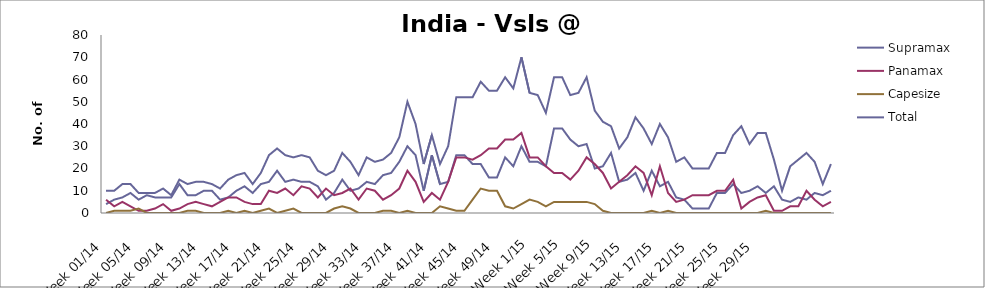
| Category | Supramax | Panamax | Capesize | Total |
|---|---|---|---|---|
| Week 01/14 | 4 | 6 | 0 | 10 |
| Week 02/14 | 6 | 3 | 1 | 10 |
| Week 03/14 | 7 | 5 | 1 | 13 |
| Week 04/14 | 9 | 3 | 1 | 13 |
| Week 05/14 | 6 | 1 | 2 | 9 |
| Week 06/14 | 8 | 1 | 0 | 9 |
| Week 07/14 | 7 | 2 | 0 | 9 |
| Week 08/14 | 7 | 4 | 0 | 11 |
| Week 09/14 | 7 | 1 | 0 | 8 |
| Week 10/14 | 13 | 2 | 0 | 15 |
| Week 11/14 | 8 | 4 | 1 | 13 |
| Week 12/14 | 8 | 5 | 1 | 14 |
| Week 13/14 | 10 | 4 | 0 | 14 |
| Week 14/14 | 10 | 3 | 0 | 13 |
| Week 15/14 | 6 | 5 | 0 | 11 |
| Week 16/14 | 7 | 7 | 1 | 15 |
| Week 17/14 | 10 | 7 | 0 | 17 |
| Week 18/14 | 12 | 5 | 1 | 18 |
| Week 19/14 | 9 | 4 | 0 | 13 |
| Week 20/14 | 13 | 4 | 1 | 18 |
| Week 21/14 | 14 | 10 | 2 | 26 |
| Week 22/14 | 19 | 9 | 0 | 29 |
| Week 23/14 | 14 | 11 | 1 | 26 |
| Week 24/14 | 15 | 8 | 2 | 25 |
| Week 25/14 | 14 | 12 | 0 | 26 |
| Week 26/14 | 14 | 11 | 0 | 25 |
| Week 27/14 | 12 | 7 | 0 | 19 |
| Week 28/14 | 6 | 11 | 0 | 17 |
| Week 29/14 | 9 | 8 | 2 | 19 |
| Week 30/14 | 15 | 9 | 3 | 27 |
| Week 31/14 | 10 | 11 | 2 | 23 |
| Week 32/14 | 11 | 6 | 0 | 17 |
| Week 33/14 | 14 | 11 | 0 | 25 |
| Week 34/14 | 13 | 10 | 0 | 23 |
| Week 35/14 | 17 | 6 | 1 | 24 |
| Week 36/14 | 18 | 8 | 1 | 27 |
| Week 37/14 | 23 | 11 | 0 | 34 |
| Week 38/14 | 30 | 19 | 1 | 50 |
| Week 39/14 | 26 | 14 | 0 | 40 |
| Week 40/14 | 10 | 5 | 0 | 22 |
| Week 41/14 | 26 | 9 | 0 | 35 |
| Week 42/14 | 13 | 6 | 3 | 22 |
| Week 43/14 | 14 | 14 | 2 | 30 |
| Week 44/14 | 26 | 25 | 1 | 52 |
| Week 45/14 | 26 | 25 | 1 | 52 |
| Week 46/14 | 22 | 24 | 6 | 52 |
| Week 47/14 | 22 | 26 | 11 | 59 |
| Week 48/14 | 16 | 29 | 10 | 55 |
| Week 49/14 | 16 | 29 | 10 | 55 |
| Week 50/14 | 25 | 33 | 3 | 61 |
| Week 51/14 | 21 | 33 | 2 | 56 |
| Week 52/14 | 30 | 36 | 4 | 70 |
| Week 1/15 | 23 | 25 | 6 | 54 |
| Week 2/15 | 23 | 25 | 5 | 53 |
| Week 3/15 | 21 | 21 | 3 | 45 |
| Week 4/15 | 38 | 18 | 5 | 61 |
| Week 5/15 | 38 | 18 | 5 | 61 |
| Week 6/15 | 33 | 15 | 5 | 53 |
| Week 7/15 | 30 | 19 | 5 | 54 |
| Week 8/15 | 31 | 25 | 5 | 61 |
| Week 9/15 | 20 | 22 | 4 | 46 |
| Week 10/15 | 21 | 18 | 1 | 41 |
| Week 11/15 | 27 | 11 | 0 | 39 |
| Week 12/15 | 14 | 14 | 0 | 29 |
| Week 13/15 | 15 | 17 | 0 | 34 |
| Week 14/15 | 18 | 21 | 0 | 43 |
| Week 15/15 | 10 | 18 | 0 | 38 |
| Week 16/15 | 19 | 8 | 1 | 31 |
| Week 17/15 | 12 | 21 | 0 | 40 |
| Week 18/15 | 14 | 9 | 1 | 34 |
| Week 19/15 | 7 | 5 | 0 | 23 |
| Week 20/15 | 6 | 6 | 0 | 25 |
| Week 21/15 | 2 | 8 | 0 | 20 |
| Week 22/15 | 2 | 8 | 0 | 20 |
| Week 23/15 | 2 | 8 | 0 | 20 |
| Week 24/15 | 9 | 10 | 0 | 27 |
| Week 25/15 | 9 | 10 | 0 | 27 |
| Week 26/15 | 13 | 15 | 0 | 35 |
| Week 27/15 | 9 | 2 | 0 | 39 |
| Week 28/15 | 10 | 5 | 0 | 31 |
| Week 29/15 | 12 | 7 | 0 | 36 |
| Week 30/15 | 9 | 8 | 1 | 36 |
| Week 31/15 | 12 | 1 | 0 | 24 |